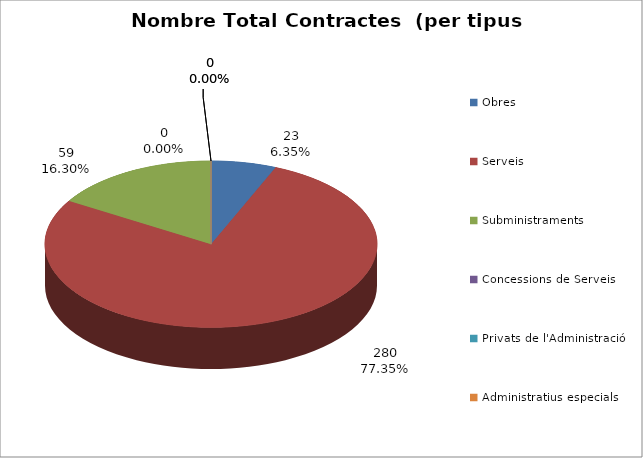
| Category | Nombre Total Contractes |
|---|---|
| Obres | 23 |
| Serveis | 280 |
| Subministraments | 59 |
| Concessions de Serveis | 0 |
| Privats de l'Administració | 0 |
| Administratius especials | 0 |